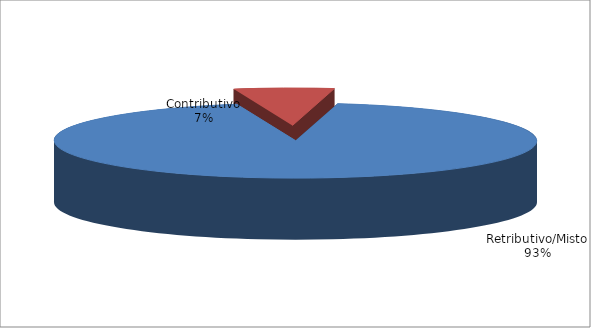
| Category | Decorrenti 2016 |
|---|---|
| Retributivo/Misto | 257822 |
| Contributivo | 18470 |